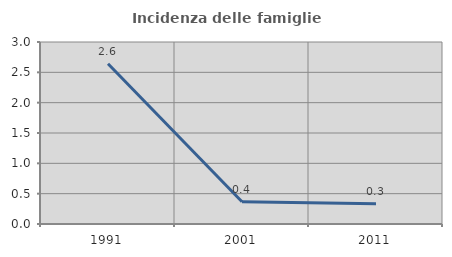
| Category | Incidenza delle famiglie numerose |
|---|---|
| 1991.0 | 2.642 |
| 2001.0 | 0.368 |
| 2011.0 | 0.334 |